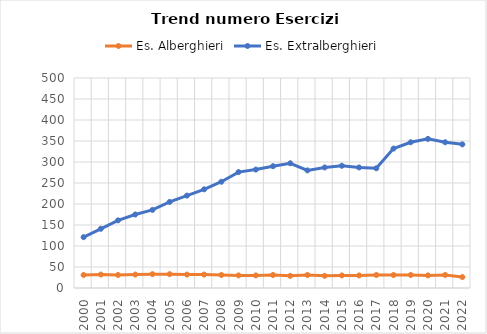
| Category | Es. Alberghieri | Es. Extralberghieri |
|---|---|---|
| 2000.0 | 31 | 121 |
| 2001.0 | 32 | 141 |
| 2002.0 | 31 | 161 |
| 2003.0 | 32 | 175 |
| 2004.0 | 33 | 186 |
| 2005.0 | 33 | 205 |
| 2006.0 | 32 | 220 |
| 2007.0 | 32 | 235 |
| 2008.0 | 31 | 253 |
| 2009.0 | 30 | 276 |
| 2010.0 | 30 | 282 |
| 2011.0 | 31 | 290 |
| 2012.0 | 29 | 297 |
| 2013.0 | 31 | 280 |
| 2014.0 | 29 | 287 |
| 2015.0 | 30 | 291 |
| 2016.0 | 30 | 287 |
| 2017.0 | 31 | 285 |
| 2018.0 | 31 | 332 |
| 2019.0 | 31 | 347 |
| 2020.0 | 30 | 355 |
| 2021.0 | 31 | 347 |
| 2022.0 | 26 | 342 |